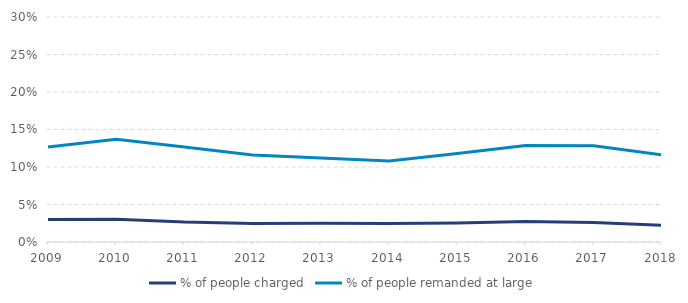
| Category | % of people charged | % of people remanded at large |
|---|---|---|
| 2009.0 | 0.03 | 0.127 |
| 2010.0 | 0.03 | 0.137 |
| 2011.0 | 0.027 | 0.127 |
| 2012.0 | 0.025 | 0.116 |
| 2013.0 | 0.025 | 0.112 |
| 2014.0 | 0.025 | 0.108 |
| 2015.0 | 0.025 | 0.118 |
| 2016.0 | 0.027 | 0.129 |
| 2017.0 | 0.026 | 0.128 |
| 2018.0 | 0.022 | 0.116 |